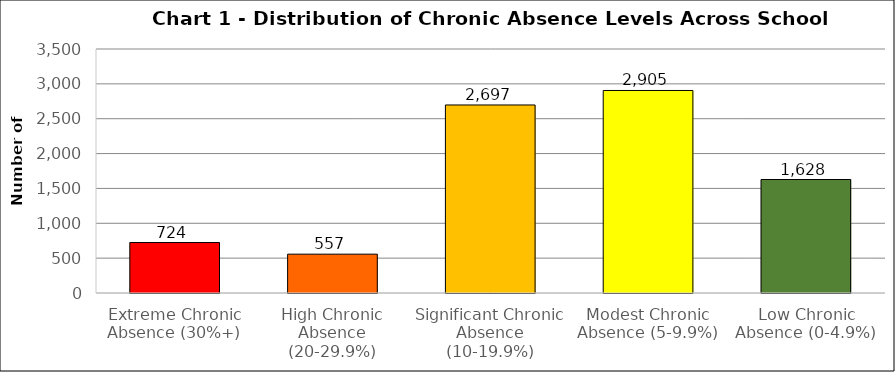
| Category | Series 0 |
|---|---|
| Extreme Chronic Absence (30%+) | 724 |
| High Chronic Absence (20-29.9%) | 557 |
| Significant Chronic Absence (10-19.9%) | 2697 |
| Modest Chronic Absence (5-9.9%) | 2905 |
| Low Chronic Absence (0-4.9%) | 1628 |